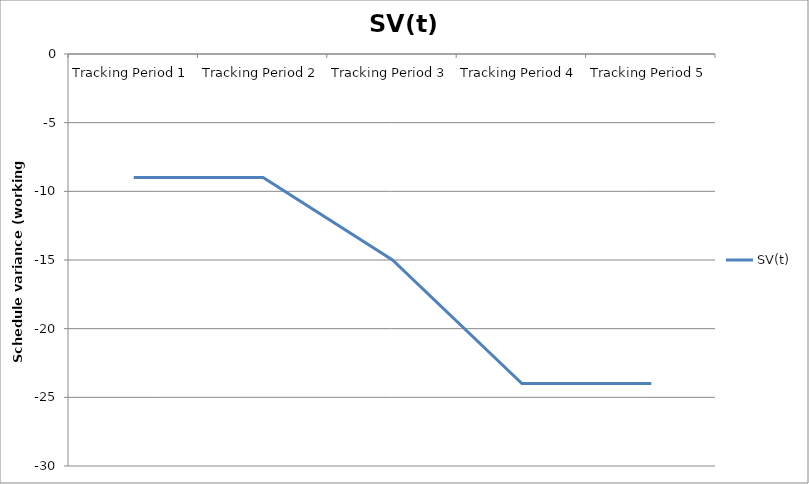
| Category | SV(t) |
|---|---|
| Tracking Period 1 | -9 |
| Tracking Period 2 | -9 |
| Tracking Period 3 | -15 |
| Tracking Period 4 | -24 |
| Tracking Period 5 | -24 |